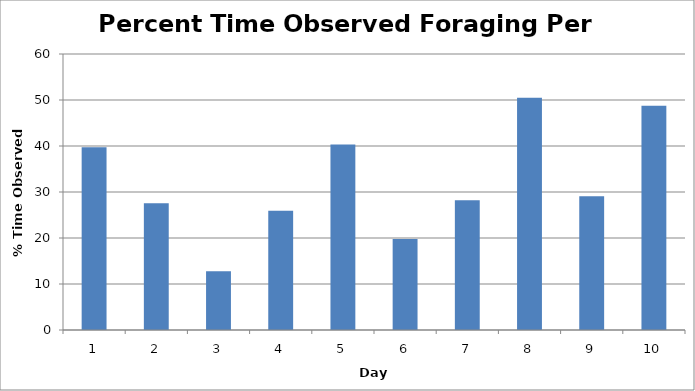
| Category | Series 0 |
|---|---|
| 0 | 39.718 |
| 1 | 27.572 |
| 2 | 12.785 |
| 3 | 25.943 |
| 4 | 40.332 |
| 5 | 19.78 |
| 6 | 28.221 |
| 7 | 50.512 |
| 8 | 29.085 |
| 9 | 48.75 |